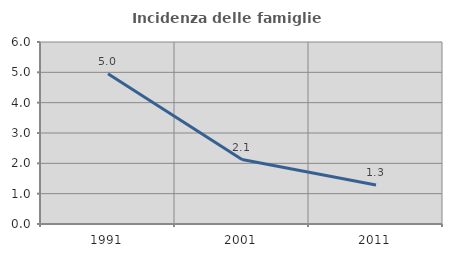
| Category | Incidenza delle famiglie numerose |
|---|---|
| 1991.0 | 4.951 |
| 2001.0 | 2.125 |
| 2011.0 | 1.284 |